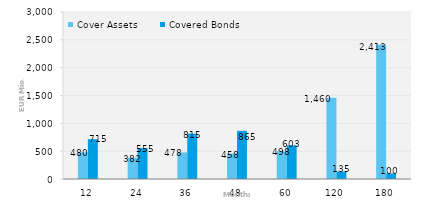
| Category | Cover Assets | Covered Bonds |
|---|---|---|
| 12.0 | 480.419 | 715 |
| 24.0 | 381.589 | 555 |
| 36.0 | 477.829 | 815 |
| 48.0 | 457.694 | 865 |
| 60.0 | 498.337 | 603 |
| 120.0 | 1460.245 | 135 |
| 180.0 | 2413.391 | 100 |